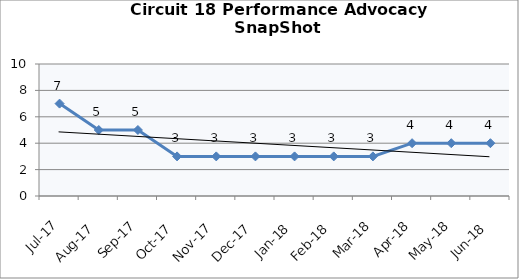
| Category | Circuit 18 |
|---|---|
| Jul-17 | 7 |
| Aug-17 | 5 |
| Sep-17 | 5 |
| Oct-17 | 3 |
| Nov-17 | 3 |
| Dec-17 | 3 |
| Jan-18 | 3 |
| Feb-18 | 3 |
| Mar-18 | 3 |
| Apr-18 | 4 |
| May-18 | 4 |
| Jun-18 | 4 |